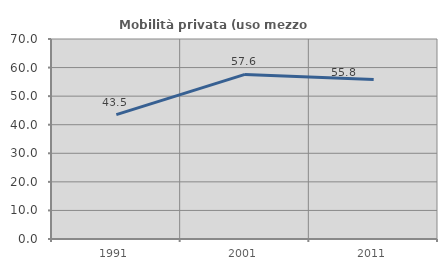
| Category | Mobilità privata (uso mezzo privato) |
|---|---|
| 1991.0 | 43.532 |
| 2001.0 | 57.604 |
| 2011.0 | 55.85 |